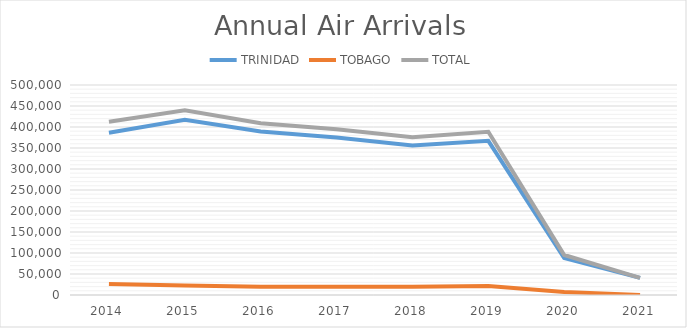
| Category | TRINIDAD | TOBAGO | TOTAL |
|---|---|---|---|
| 2014.0 | 386262 | 26185 | 412447 |
| 2015.0 | 417317 | 22435 | 439749 |
| 2016.0 | 389404 | 19378 | 408782 |
| 2017.0 | 375202 | 19448 | 394650 |
| 2018.0 | 356044 | 19441 | 375485 |
| 2019.0 | 367119 | 21457 | 388576 |
| 2020.0 | 88036 | 7248 | 95284 |
| 2021.0 | 40618 | 3 | 40621 |